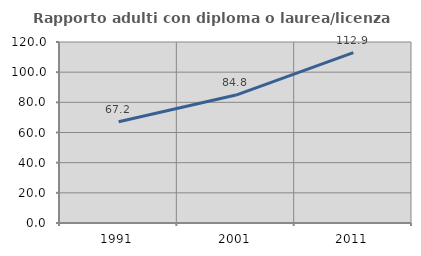
| Category | Rapporto adulti con diploma o laurea/licenza media  |
|---|---|
| 1991.0 | 67.164 |
| 2001.0 | 84.831 |
| 2011.0 | 112.921 |